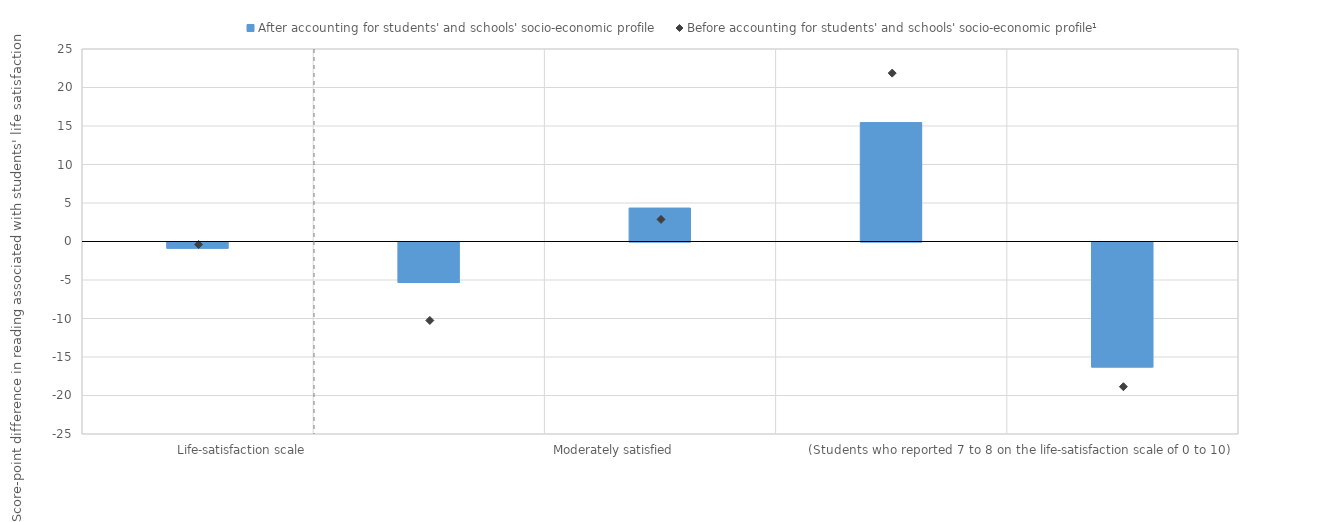
| Category | After accounting for students' and schools' socio-economic profile |
|---|---|
|                       Life-satisfaction scale | -0.807 |
| Not satisfied                                                       (Students who reported 0 to 4 on the life-satisfaction scale of 0 to 10) | -5.266 |
| Somewhat satisfied                                                     (Students who reported 5 to 6 on the life-satisfaction scale of 0 to 10) | 4.344 |
| Moderately satisfied                                  (Students who reported 7 to 8 on the life-satisfaction scale of 0 to 10) | 15.446 |
| Very satisfied                                               (Students who reported 9 to 10 on the life-satisfaction scale of 0 to 10)  | -16.243 |